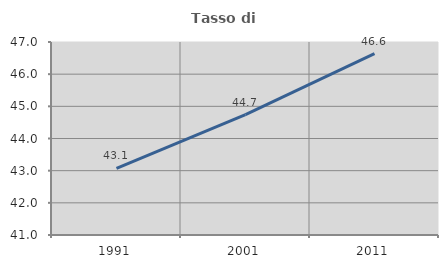
| Category | Tasso di occupazione   |
|---|---|
| 1991.0 | 43.069 |
| 2001.0 | 44.743 |
| 2011.0 | 46.636 |